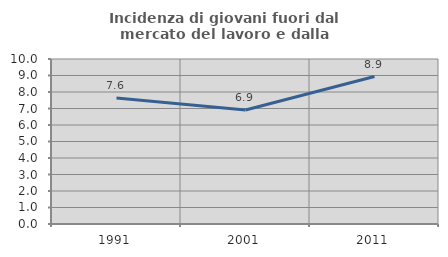
| Category | Incidenza di giovani fuori dal mercato del lavoro e dalla formazione  |
|---|---|
| 1991.0 | 7.639 |
| 2001.0 | 6.912 |
| 2011.0 | 8.936 |